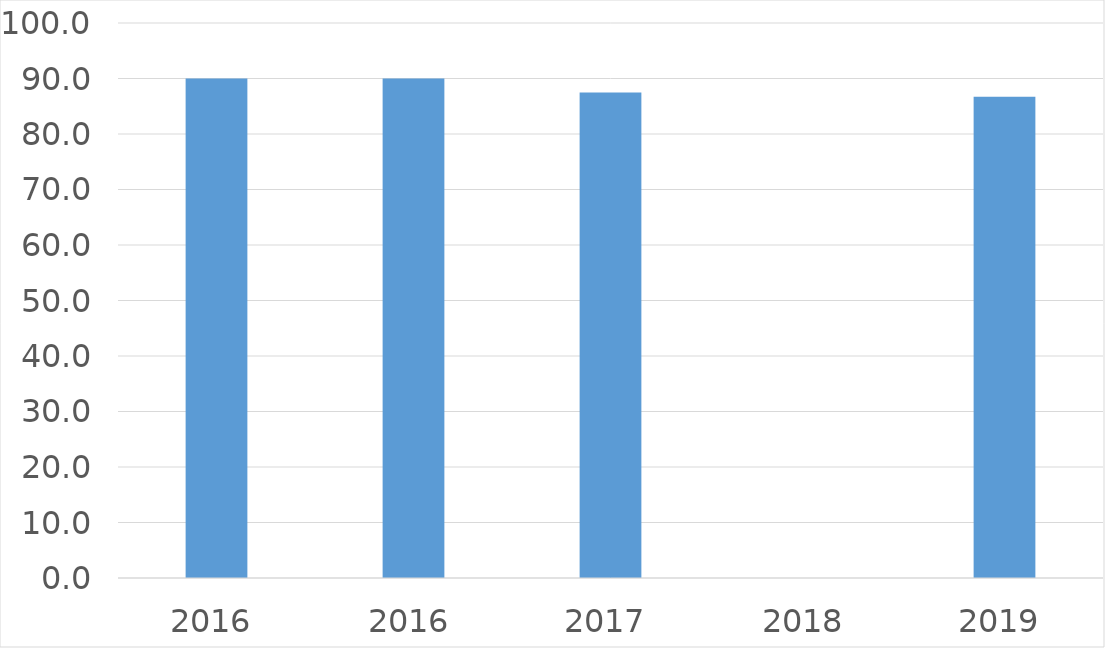
| Category | Series 0 |
|---|---|
| 2016 | 90 |
| 2016 | 90 |
| 2017 | 87.5 |
| 2018 | 0 |
| 2019 | 86.7 |